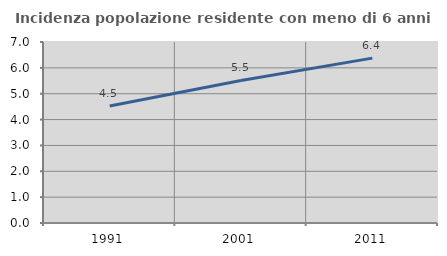
| Category | Incidenza popolazione residente con meno di 6 anni |
|---|---|
| 1991.0 | 4.528 |
| 2001.0 | 5.512 |
| 2011.0 | 6.376 |